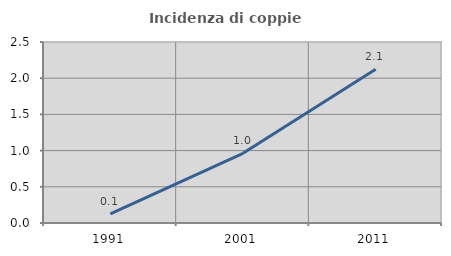
| Category | Incidenza di coppie miste |
|---|---|
| 1991.0 | 0.125 |
| 2001.0 | 0.962 |
| 2011.0 | 2.123 |